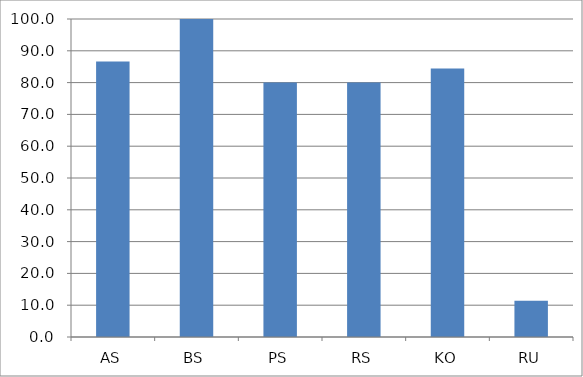
| Category | Series 0 |
|---|---|
| AS | 86.667 |
| BS | 100 |
| PS | 80 |
| RS | 80 |
| KO | 84.444 |
| RU | 11.429 |